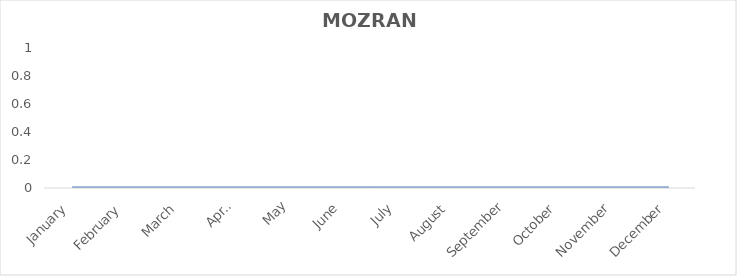
| Category | MozRank |
|---|---|
| January | 0 |
| February | 0 |
| March | 0 |
| April | 0 |
| May | 0 |
| June | 0 |
| July | 0 |
| August | 0 |
| September | 0 |
| October | 0 |
| November | 0 |
| December | 0 |